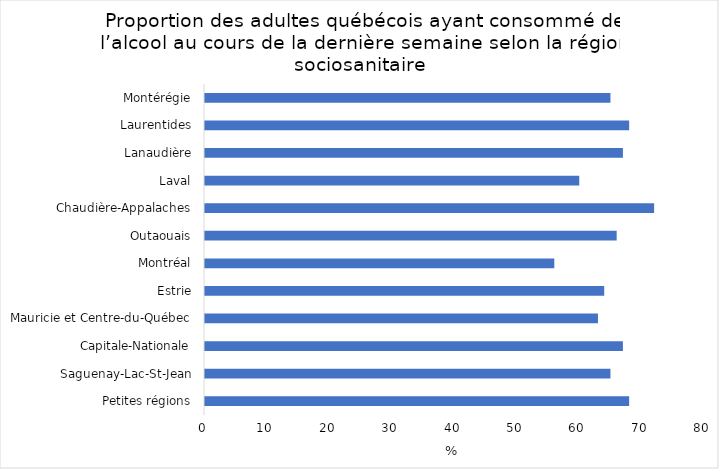
| Category | Series 0 |
|---|---|
| Petites régions | 68 |
| Saguenay-Lac-St-Jean | 65 |
| Capitale-Nationale | 67 |
| Mauricie et Centre-du-Québec | 63 |
| Estrie | 64 |
| Montréal | 56 |
| Outaouais | 66 |
| Chaudière-Appalaches | 72 |
| Laval | 60 |
| Lanaudière | 67 |
| Laurentides | 68 |
| Montérégie | 65 |